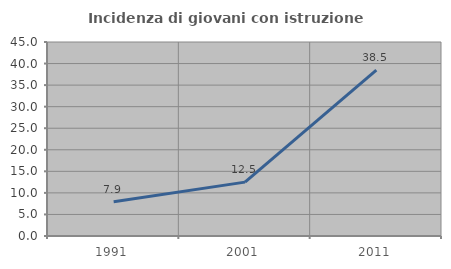
| Category | Incidenza di giovani con istruzione universitaria |
|---|---|
| 1991.0 | 7.937 |
| 2001.0 | 12.5 |
| 2011.0 | 38.462 |